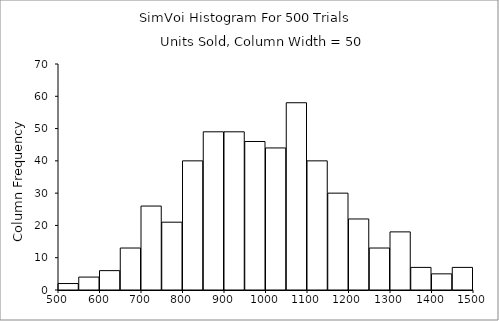
| Category | Series 0 |
|---|---|
| 550.0 | 2 |
| 600.0 | 4 |
| 650.0 | 6 |
| 700.0 | 13 |
| 750.0 | 26 |
| 800.0 | 21 |
| 850.0 | 40 |
| 900.0 | 49 |
| 950.0 | 49 |
| 1000.0 | 46 |
| 1050.0 | 44 |
| 1100.0 | 58 |
| 1150.0 | 40 |
| 1200.0 | 30 |
| 1250.0 | 22 |
| 1300.0 | 13 |
| 1350.0 | 18 |
| 1400.0 | 7 |
| 1450.0 | 5 |
| 1500.0 | 7 |